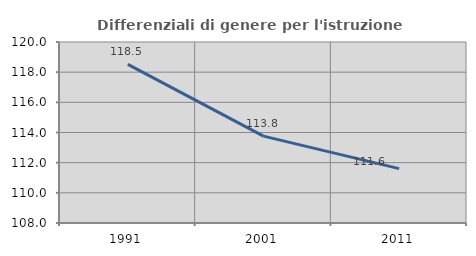
| Category | Differenziali di genere per l'istruzione superiore |
|---|---|
| 1991.0 | 118.52 |
| 2001.0 | 113.761 |
| 2011.0 | 111.602 |